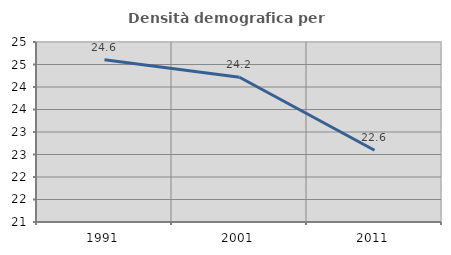
| Category | Densità demografica |
|---|---|
| 1991.0 | 24.603 |
| 2001.0 | 24.216 |
| 2011.0 | 22.596 |